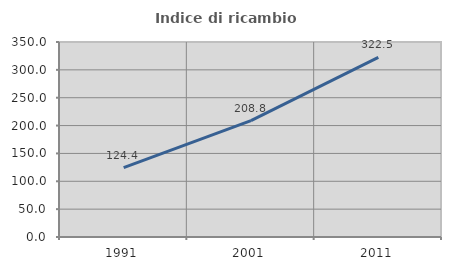
| Category | Indice di ricambio occupazionale  |
|---|---|
| 1991.0 | 124.406 |
| 2001.0 | 208.78 |
| 2011.0 | 322.515 |